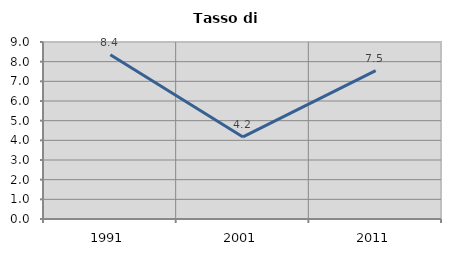
| Category | Tasso di disoccupazione   |
|---|---|
| 1991.0 | 8.355 |
| 2001.0 | 4.175 |
| 2011.0 | 7.544 |